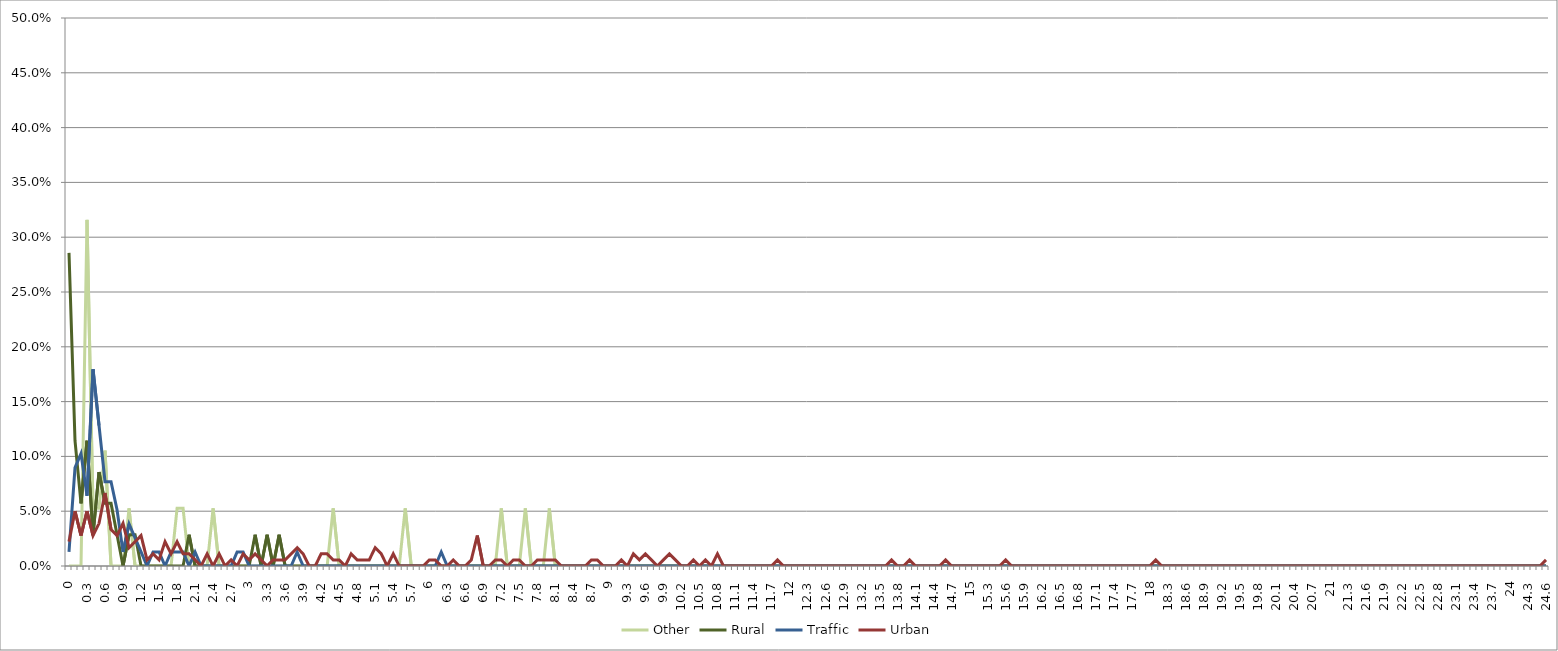
| Category | Other | Rural | Traffic | Urban |
|---|---|---|---|---|
| 0.0 | 0 | 0.286 | 0.013 | 0.022 |
| 0.1 | 0 | 0.114 | 0.09 | 0.05 |
| 0.2 | 0 | 0.057 | 0.103 | 0.028 |
| 0.3 | 0.316 | 0.114 | 0.064 | 0.05 |
| 0.4 | 0.053 | 0.029 | 0.179 | 0.028 |
| 0.5 | 0.053 | 0.086 | 0.128 | 0.039 |
| 0.6 | 0.105 | 0.057 | 0.077 | 0.067 |
| 0.7 | 0 | 0.057 | 0.077 | 0.033 |
| 0.8 | 0 | 0.029 | 0.051 | 0.028 |
| 0.9 | 0 | 0 | 0.013 | 0.039 |
| 1.0 | 0.053 | 0.029 | 0.038 | 0.017 |
| 1.1 | 0 | 0.029 | 0.026 | 0.022 |
| 1.2 | 0 | 0 | 0.013 | 0.028 |
| 1.3 | 0 | 0 | 0 | 0.006 |
| 1.4 | 0 | 0 | 0.013 | 0.011 |
| 1.5 | 0 | 0 | 0.013 | 0.006 |
| 1.6 | 0 | 0 | 0 | 0.022 |
| 1.7 | 0 | 0 | 0.013 | 0.011 |
| 1.8 | 0.053 | 0 | 0.013 | 0.022 |
| 1.9 | 0.053 | 0 | 0.013 | 0.011 |
| 2.0 | 0 | 0.029 | 0 | 0.011 |
| 2.1 | 0 | 0 | 0.013 | 0.006 |
| 2.2 | 0 | 0 | 0 | 0 |
| 2.3 | 0 | 0 | 0 | 0.011 |
| 2.4 | 0.053 | 0 | 0 | 0 |
| 2.5 | 0 | 0 | 0 | 0.011 |
| 2.6 | 0 | 0 | 0 | 0 |
| 2.7 | 0 | 0 | 0 | 0.006 |
| 2.8 | 0 | 0 | 0.013 | 0 |
| 2.9 | 0 | 0 | 0.013 | 0.011 |
| 3.0 | 0 | 0 | 0 | 0.006 |
| 3.1 | 0 | 0.029 | 0 | 0.011 |
| 3.2 | 0 | 0 | 0 | 0.006 |
| 3.3 | 0 | 0.029 | 0 | 0 |
| 3.4 | 0 | 0 | 0 | 0.006 |
| 3.5 | 0 | 0.029 | 0 | 0.006 |
| 3.6 | 0 | 0 | 0 | 0.006 |
| 3.7 | 0 | 0 | 0 | 0.011 |
| 3.8 | 0 | 0 | 0.013 | 0.017 |
| 3.9 | 0 | 0 | 0 | 0.011 |
| 4.0 | 0 | 0 | 0 | 0 |
| 4.1 | 0 | 0 | 0 | 0 |
| 4.2 | 0 | 0 | 0 | 0.011 |
| 4.3 | 0 | 0 | 0 | 0.011 |
| 4.4 | 0.053 | 0 | 0 | 0.006 |
| 4.5 | 0 | 0 | 0 | 0.006 |
| 4.6 | 0 | 0 | 0 | 0 |
| 4.7 | 0 | 0 | 0 | 0.011 |
| 4.8 | 0 | 0 | 0 | 0.006 |
| 4.9 | 0 | 0 | 0 | 0.006 |
| 5.0 | 0 | 0 | 0 | 0.006 |
| 5.1 | 0 | 0 | 0 | 0.017 |
| 5.2 | 0 | 0 | 0 | 0.011 |
| 5.3 | 0 | 0 | 0 | 0 |
| 5.4 | 0 | 0 | 0 | 0.011 |
| 5.5 | 0 | 0 | 0 | 0 |
| 5.6 | 0.053 | 0 | 0 | 0 |
| 5.7 | 0 | 0 | 0 | 0 |
| 5.8 | 0 | 0 | 0 | 0 |
| 5.9 | 0 | 0 | 0 | 0 |
| 5.99999999999999 | 0 | 0 | 0 | 0.006 |
| 6.09999999999999 | 0 | 0 | 0 | 0.006 |
| 6.19999999999999 | 0 | 0 | 0.013 | 0 |
| 6.29999999999999 | 0 | 0 | 0 | 0 |
| 6.39999999999999 | 0 | 0 | 0 | 0.006 |
| 6.49999999999999 | 0 | 0 | 0 | 0 |
| 6.59999999999999 | 0 | 0 | 0 | 0 |
| 6.69999999999999 | 0 | 0 | 0 | 0.006 |
| 6.79999999999999 | 0 | 0 | 0 | 0.028 |
| 6.89999999999999 | 0 | 0 | 0 | 0 |
| 6.99999999999999 | 0 | 0 | 0 | 0 |
| 7.09999999999999 | 0 | 0 | 0 | 0.006 |
| 7.19999999999999 | 0.053 | 0 | 0 | 0.006 |
| 7.29999999999999 | 0 | 0 | 0 | 0 |
| 7.39999999999999 | 0 | 0 | 0 | 0.006 |
| 7.49999999999999 | 0 | 0 | 0 | 0.006 |
| 7.59999999999999 | 0.053 | 0 | 0 | 0 |
| 7.69999999999999 | 0 | 0 | 0 | 0 |
| 7.79999999999999 | 0 | 0 | 0 | 0.006 |
| 7.89999999999999 | 0 | 0 | 0 | 0.006 |
| 7.99999999999999 | 0.053 | 0 | 0 | 0.006 |
| 8.09999999999999 | 0 | 0 | 0 | 0.006 |
| 8.19999999999999 | 0 | 0 | 0 | 0 |
| 8.29999999999999 | 0 | 0 | 0 | 0 |
| 8.39999999999999 | 0 | 0 | 0 | 0 |
| 8.49999999999999 | 0 | 0 | 0 | 0 |
| 8.59999999999999 | 0 | 0 | 0 | 0 |
| 8.69999999999999 | 0 | 0 | 0 | 0.006 |
| 8.79999999999998 | 0 | 0 | 0 | 0.006 |
| 8.89999999999998 | 0 | 0 | 0 | 0 |
| 8.99999999999998 | 0 | 0 | 0 | 0 |
| 9.09999999999998 | 0 | 0 | 0 | 0 |
| 9.19999999999998 | 0 | 0 | 0 | 0.006 |
| 9.29999999999998 | 0 | 0 | 0 | 0 |
| 9.39999999999998 | 0 | 0 | 0 | 0.011 |
| 9.49999999999998 | 0 | 0 | 0 | 0.006 |
| 9.59999999999998 | 0 | 0 | 0 | 0.011 |
| 9.69999999999998 | 0 | 0 | 0 | 0.006 |
| 9.79999999999998 | 0 | 0 | 0 | 0 |
| 9.89999999999998 | 0 | 0 | 0 | 0.006 |
| 9.99999999999998 | 0 | 0 | 0 | 0.011 |
| 10.1 | 0 | 0 | 0 | 0.006 |
| 10.2 | 0 | 0 | 0 | 0 |
| 10.3 | 0 | 0 | 0 | 0 |
| 10.4 | 0 | 0 | 0 | 0.006 |
| 10.5 | 0 | 0 | 0 | 0 |
| 10.6 | 0 | 0 | 0 | 0.006 |
| 10.7 | 0 | 0 | 0 | 0 |
| 10.8 | 0 | 0 | 0 | 0.011 |
| 10.9 | 0 | 0 | 0 | 0 |
| 11.0 | 0 | 0 | 0 | 0 |
| 11.1 | 0 | 0 | 0 | 0 |
| 11.2 | 0 | 0 | 0 | 0 |
| 11.3 | 0 | 0 | 0 | 0 |
| 11.4 | 0 | 0 | 0 | 0 |
| 11.5 | 0 | 0 | 0 | 0 |
| 11.6 | 0 | 0 | 0 | 0 |
| 11.7 | 0 | 0 | 0 | 0 |
| 11.8 | 0 | 0 | 0 | 0.006 |
| 11.9 | 0 | 0 | 0 | 0 |
| 12.0 | 0 | 0 | 0 | 0 |
| 12.1 | 0 | 0 | 0 | 0 |
| 12.2 | 0 | 0 | 0 | 0 |
| 12.3 | 0 | 0 | 0 | 0 |
| 12.4 | 0 | 0 | 0 | 0 |
| 12.5 | 0 | 0 | 0 | 0 |
| 12.6 | 0 | 0 | 0 | 0 |
| 12.7 | 0 | 0 | 0 | 0 |
| 12.8 | 0 | 0 | 0 | 0 |
| 12.9 | 0 | 0 | 0 | 0 |
| 13.0 | 0 | 0 | 0 | 0 |
| 13.1 | 0 | 0 | 0 | 0 |
| 13.2 | 0 | 0 | 0 | 0 |
| 13.3 | 0 | 0 | 0 | 0 |
| 13.4 | 0 | 0 | 0 | 0 |
| 13.5 | 0 | 0 | 0 | 0 |
| 13.6 | 0 | 0 | 0 | 0 |
| 13.7 | 0 | 0 | 0 | 0.006 |
| 13.8 | 0 | 0 | 0 | 0 |
| 13.9 | 0 | 0 | 0 | 0 |
| 14.0 | 0 | 0 | 0 | 0.006 |
| 14.1 | 0 | 0 | 0 | 0 |
| 14.2 | 0 | 0 | 0 | 0 |
| 14.3 | 0 | 0 | 0 | 0 |
| 14.4 | 0 | 0 | 0 | 0 |
| 14.5 | 0 | 0 | 0 | 0 |
| 14.6 | 0 | 0 | 0 | 0.006 |
| 14.7 | 0 | 0 | 0 | 0 |
| 14.8 | 0 | 0 | 0 | 0 |
| 14.9 | 0 | 0 | 0 | 0 |
| 15.0 | 0 | 0 | 0 | 0 |
| 15.1 | 0 | 0 | 0 | 0 |
| 15.2 | 0 | 0 | 0 | 0 |
| 15.3 | 0 | 0 | 0 | 0 |
| 15.4 | 0 | 0 | 0 | 0 |
| 15.5 | 0 | 0 | 0 | 0 |
| 15.6 | 0 | 0 | 0 | 0.006 |
| 15.7 | 0 | 0 | 0 | 0 |
| 15.8 | 0 | 0 | 0 | 0 |
| 15.9 | 0 | 0 | 0 | 0 |
| 16.0 | 0 | 0 | 0 | 0 |
| 16.1 | 0 | 0 | 0 | 0 |
| 16.2 | 0 | 0 | 0 | 0 |
| 16.3 | 0 | 0 | 0 | 0 |
| 16.4 | 0 | 0 | 0 | 0 |
| 16.5 | 0 | 0 | 0 | 0 |
| 16.6 | 0 | 0 | 0 | 0 |
| 16.7 | 0 | 0 | 0 | 0 |
| 16.8 | 0 | 0 | 0 | 0 |
| 16.9 | 0 | 0 | 0 | 0 |
| 17.0 | 0 | 0 | 0 | 0 |
| 17.1 | 0 | 0 | 0 | 0 |
| 17.2 | 0 | 0 | 0 | 0 |
| 17.3 | 0 | 0 | 0 | 0 |
| 17.4 | 0 | 0 | 0 | 0 |
| 17.5 | 0 | 0 | 0 | 0 |
| 17.6 | 0 | 0 | 0 | 0 |
| 17.7 | 0 | 0 | 0 | 0 |
| 17.8 | 0 | 0 | 0 | 0 |
| 17.9 | 0 | 0 | 0 | 0 |
| 18.0 | 0 | 0 | 0 | 0 |
| 18.1 | 0 | 0 | 0 | 0.006 |
| 18.2 | 0 | 0 | 0 | 0 |
| 18.3 | 0 | 0 | 0 | 0 |
| 18.4 | 0 | 0 | 0 | 0 |
| 18.5 | 0 | 0 | 0 | 0 |
| 18.6 | 0 | 0 | 0 | 0 |
| 18.7 | 0 | 0 | 0 | 0 |
| 18.8 | 0 | 0 | 0 | 0 |
| 18.9 | 0 | 0 | 0 | 0 |
| 19.0 | 0 | 0 | 0 | 0 |
| 19.1 | 0 | 0 | 0 | 0 |
| 19.2 | 0 | 0 | 0 | 0 |
| 19.3 | 0 | 0 | 0 | 0 |
| 19.4 | 0 | 0 | 0 | 0 |
| 19.5 | 0 | 0 | 0 | 0 |
| 19.6 | 0 | 0 | 0 | 0 |
| 19.7 | 0 | 0 | 0 | 0 |
| 19.8 | 0 | 0 | 0 | 0 |
| 19.9 | 0 | 0 | 0 | 0 |
| 20.0 | 0 | 0 | 0 | 0 |
| 20.1 | 0 | 0 | 0 | 0 |
| 20.2 | 0 | 0 | 0 | 0 |
| 20.3 | 0 | 0 | 0 | 0 |
| 20.4 | 0 | 0 | 0 | 0 |
| 20.5 | 0 | 0 | 0 | 0 |
| 20.6 | 0 | 0 | 0 | 0 |
| 20.7 | 0 | 0 | 0 | 0 |
| 20.8 | 0 | 0 | 0 | 0 |
| 20.9 | 0 | 0 | 0 | 0 |
| 21.0 | 0 | 0 | 0 | 0 |
| 21.1 | 0 | 0 | 0 | 0 |
| 21.2 | 0 | 0 | 0 | 0 |
| 21.3 | 0 | 0 | 0 | 0 |
| 21.4 | 0 | 0 | 0 | 0 |
| 21.5 | 0 | 0 | 0 | 0 |
| 21.6 | 0 | 0 | 0 | 0 |
| 21.7 | 0 | 0 | 0 | 0 |
| 21.8 | 0 | 0 | 0 | 0 |
| 21.9 | 0 | 0 | 0 | 0 |
| 22.0 | 0 | 0 | 0 | 0 |
| 22.1 | 0 | 0 | 0 | 0 |
| 22.2 | 0 | 0 | 0 | 0 |
| 22.3 | 0 | 0 | 0 | 0 |
| 22.4 | 0 | 0 | 0 | 0 |
| 22.5000000000001 | 0 | 0 | 0 | 0 |
| 22.6000000000001 | 0 | 0 | 0 | 0 |
| 22.7000000000001 | 0 | 0 | 0 | 0 |
| 22.8000000000001 | 0 | 0 | 0 | 0 |
| 22.9000000000001 | 0 | 0 | 0 | 0 |
| 23.0000000000001 | 0 | 0 | 0 | 0 |
| 23.1000000000001 | 0 | 0 | 0 | 0 |
| 23.2000000000001 | 0 | 0 | 0 | 0 |
| 23.3000000000001 | 0 | 0 | 0 | 0 |
| 23.4000000000001 | 0 | 0 | 0 | 0 |
| 23.5000000000001 | 0 | 0 | 0 | 0 |
| 23.6000000000001 | 0 | 0 | 0 | 0 |
| 23.7000000000001 | 0 | 0 | 0 | 0 |
| 23.8000000000001 | 0 | 0 | 0 | 0 |
| 23.9000000000001 | 0 | 0 | 0 | 0 |
| 24.0000000000001 | 0 | 0 | 0 | 0 |
| 24.1000000000001 | 0 | 0 | 0 | 0 |
| 24.2000000000001 | 0 | 0 | 0 | 0 |
| 24.3000000000001 | 0 | 0 | 0 | 0 |
| 24.4000000000001 | 0 | 0 | 0 | 0 |
| 24.5000000000001 | 0 | 0 | 0 | 0 |
| 24.6000000000001 | 0 | 0 | 0 | 0.006 |